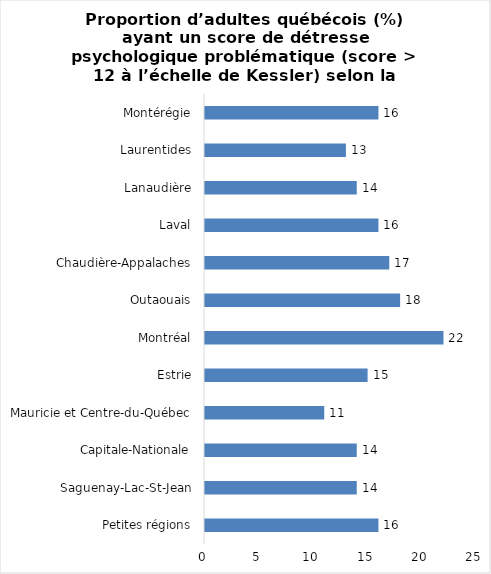
| Category | Series 0 |
|---|---|
| Petites régions | 16 |
| Saguenay-Lac-St-Jean | 14 |
| Capitale-Nationale | 14 |
| Mauricie et Centre-du-Québec | 11 |
| Estrie | 15 |
| Montréal | 22 |
| Outaouais | 18 |
| Chaudière-Appalaches | 17 |
| Laval | 16 |
| Lanaudière | 14 |
| Laurentides | 13 |
| Montérégie | 16 |